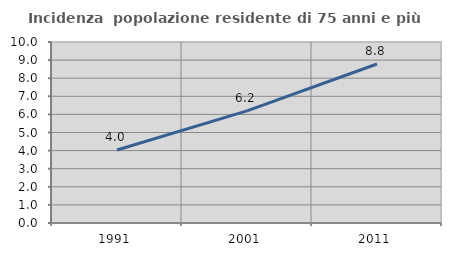
| Category | Incidenza  popolazione residente di 75 anni e più |
|---|---|
| 1991.0 | 4.032 |
| 2001.0 | 6.193 |
| 2011.0 | 8.785 |